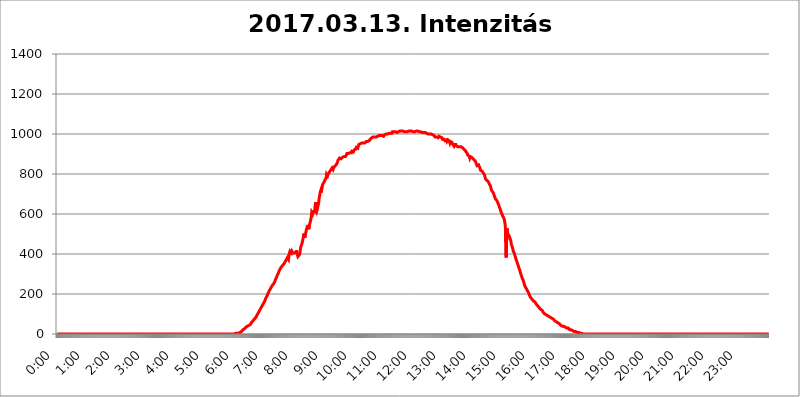
| Category | 2017.03.13. Intenzitás [W/m^2] |
|---|---|
| 0.0 | 0 |
| 0.0006944444444444445 | 0 |
| 0.001388888888888889 | 0 |
| 0.0020833333333333333 | 0 |
| 0.002777777777777778 | 0 |
| 0.003472222222222222 | 0 |
| 0.004166666666666667 | 0 |
| 0.004861111111111111 | 0 |
| 0.005555555555555556 | 0 |
| 0.0062499999999999995 | 0 |
| 0.006944444444444444 | 0 |
| 0.007638888888888889 | 0 |
| 0.008333333333333333 | 0 |
| 0.009027777777777779 | 0 |
| 0.009722222222222222 | 0 |
| 0.010416666666666666 | 0 |
| 0.011111111111111112 | 0 |
| 0.011805555555555555 | 0 |
| 0.012499999999999999 | 0 |
| 0.013194444444444444 | 0 |
| 0.013888888888888888 | 0 |
| 0.014583333333333332 | 0 |
| 0.015277777777777777 | 0 |
| 0.015972222222222224 | 0 |
| 0.016666666666666666 | 0 |
| 0.017361111111111112 | 0 |
| 0.018055555555555557 | 0 |
| 0.01875 | 0 |
| 0.019444444444444445 | 0 |
| 0.02013888888888889 | 0 |
| 0.020833333333333332 | 0 |
| 0.02152777777777778 | 0 |
| 0.022222222222222223 | 0 |
| 0.02291666666666667 | 0 |
| 0.02361111111111111 | 0 |
| 0.024305555555555556 | 0 |
| 0.024999999999999998 | 0 |
| 0.025694444444444447 | 0 |
| 0.02638888888888889 | 0 |
| 0.027083333333333334 | 0 |
| 0.027777777777777776 | 0 |
| 0.02847222222222222 | 0 |
| 0.029166666666666664 | 0 |
| 0.029861111111111113 | 0 |
| 0.030555555555555555 | 0 |
| 0.03125 | 0 |
| 0.03194444444444445 | 0 |
| 0.03263888888888889 | 0 |
| 0.03333333333333333 | 0 |
| 0.034027777777777775 | 0 |
| 0.034722222222222224 | 0 |
| 0.035416666666666666 | 0 |
| 0.036111111111111115 | 0 |
| 0.03680555555555556 | 0 |
| 0.0375 | 0 |
| 0.03819444444444444 | 0 |
| 0.03888888888888889 | 0 |
| 0.03958333333333333 | 0 |
| 0.04027777777777778 | 0 |
| 0.04097222222222222 | 0 |
| 0.041666666666666664 | 0 |
| 0.042361111111111106 | 0 |
| 0.04305555555555556 | 0 |
| 0.043750000000000004 | 0 |
| 0.044444444444444446 | 0 |
| 0.04513888888888889 | 0 |
| 0.04583333333333334 | 0 |
| 0.04652777777777778 | 0 |
| 0.04722222222222222 | 0 |
| 0.04791666666666666 | 0 |
| 0.04861111111111111 | 0 |
| 0.049305555555555554 | 0 |
| 0.049999999999999996 | 0 |
| 0.05069444444444445 | 0 |
| 0.051388888888888894 | 0 |
| 0.052083333333333336 | 0 |
| 0.05277777777777778 | 0 |
| 0.05347222222222222 | 0 |
| 0.05416666666666667 | 0 |
| 0.05486111111111111 | 0 |
| 0.05555555555555555 | 0 |
| 0.05625 | 0 |
| 0.05694444444444444 | 0 |
| 0.057638888888888885 | 0 |
| 0.05833333333333333 | 0 |
| 0.05902777777777778 | 0 |
| 0.059722222222222225 | 0 |
| 0.06041666666666667 | 0 |
| 0.061111111111111116 | 0 |
| 0.06180555555555556 | 0 |
| 0.0625 | 0 |
| 0.06319444444444444 | 0 |
| 0.06388888888888888 | 0 |
| 0.06458333333333334 | 0 |
| 0.06527777777777778 | 0 |
| 0.06597222222222222 | 0 |
| 0.06666666666666667 | 0 |
| 0.06736111111111111 | 0 |
| 0.06805555555555555 | 0 |
| 0.06874999999999999 | 0 |
| 0.06944444444444443 | 0 |
| 0.07013888888888889 | 0 |
| 0.07083333333333333 | 0 |
| 0.07152777777777779 | 0 |
| 0.07222222222222223 | 0 |
| 0.07291666666666667 | 0 |
| 0.07361111111111111 | 0 |
| 0.07430555555555556 | 0 |
| 0.075 | 0 |
| 0.07569444444444444 | 0 |
| 0.0763888888888889 | 0 |
| 0.07708333333333334 | 0 |
| 0.07777777777777778 | 0 |
| 0.07847222222222222 | 0 |
| 0.07916666666666666 | 0 |
| 0.0798611111111111 | 0 |
| 0.08055555555555556 | 0 |
| 0.08125 | 0 |
| 0.08194444444444444 | 0 |
| 0.08263888888888889 | 0 |
| 0.08333333333333333 | 0 |
| 0.08402777777777777 | 0 |
| 0.08472222222222221 | 0 |
| 0.08541666666666665 | 0 |
| 0.08611111111111112 | 0 |
| 0.08680555555555557 | 0 |
| 0.08750000000000001 | 0 |
| 0.08819444444444445 | 0 |
| 0.08888888888888889 | 0 |
| 0.08958333333333333 | 0 |
| 0.09027777777777778 | 0 |
| 0.09097222222222222 | 0 |
| 0.09166666666666667 | 0 |
| 0.09236111111111112 | 0 |
| 0.09305555555555556 | 0 |
| 0.09375 | 0 |
| 0.09444444444444444 | 0 |
| 0.09513888888888888 | 0 |
| 0.09583333333333333 | 0 |
| 0.09652777777777777 | 0 |
| 0.09722222222222222 | 0 |
| 0.09791666666666667 | 0 |
| 0.09861111111111111 | 0 |
| 0.09930555555555555 | 0 |
| 0.09999999999999999 | 0 |
| 0.10069444444444443 | 0 |
| 0.1013888888888889 | 0 |
| 0.10208333333333335 | 0 |
| 0.10277777777777779 | 0 |
| 0.10347222222222223 | 0 |
| 0.10416666666666667 | 0 |
| 0.10486111111111111 | 0 |
| 0.10555555555555556 | 0 |
| 0.10625 | 0 |
| 0.10694444444444444 | 0 |
| 0.1076388888888889 | 0 |
| 0.10833333333333334 | 0 |
| 0.10902777777777778 | 0 |
| 0.10972222222222222 | 0 |
| 0.1111111111111111 | 0 |
| 0.11180555555555556 | 0 |
| 0.11180555555555556 | 0 |
| 0.1125 | 0 |
| 0.11319444444444444 | 0 |
| 0.11388888888888889 | 0 |
| 0.11458333333333333 | 0 |
| 0.11527777777777777 | 0 |
| 0.11597222222222221 | 0 |
| 0.11666666666666665 | 0 |
| 0.1173611111111111 | 0 |
| 0.11805555555555557 | 0 |
| 0.11944444444444445 | 0 |
| 0.12013888888888889 | 0 |
| 0.12083333333333333 | 0 |
| 0.12152777777777778 | 0 |
| 0.12222222222222223 | 0 |
| 0.12291666666666667 | 0 |
| 0.12291666666666667 | 0 |
| 0.12361111111111112 | 0 |
| 0.12430555555555556 | 0 |
| 0.125 | 0 |
| 0.12569444444444444 | 0 |
| 0.12638888888888888 | 0 |
| 0.12708333333333333 | 0 |
| 0.16875 | 0 |
| 0.12847222222222224 | 0 |
| 0.12916666666666668 | 0 |
| 0.12986111111111112 | 0 |
| 0.13055555555555556 | 0 |
| 0.13125 | 0 |
| 0.13194444444444445 | 0 |
| 0.1326388888888889 | 0 |
| 0.13333333333333333 | 0 |
| 0.13402777777777777 | 0 |
| 0.13402777777777777 | 0 |
| 0.13472222222222222 | 0 |
| 0.13541666666666666 | 0 |
| 0.1361111111111111 | 0 |
| 0.13749999999999998 | 0 |
| 0.13819444444444443 | 0 |
| 0.1388888888888889 | 0 |
| 0.13958333333333334 | 0 |
| 0.14027777777777778 | 0 |
| 0.14097222222222222 | 0 |
| 0.14166666666666666 | 0 |
| 0.1423611111111111 | 0 |
| 0.14305555555555557 | 0 |
| 0.14375000000000002 | 0 |
| 0.14444444444444446 | 0 |
| 0.1451388888888889 | 0 |
| 0.1451388888888889 | 0 |
| 0.14652777777777778 | 0 |
| 0.14722222222222223 | 0 |
| 0.14791666666666667 | 0 |
| 0.1486111111111111 | 0 |
| 0.14930555555555555 | 0 |
| 0.15 | 0 |
| 0.15069444444444444 | 0 |
| 0.15138888888888888 | 0 |
| 0.15208333333333332 | 0 |
| 0.15277777777777776 | 0 |
| 0.15347222222222223 | 0 |
| 0.15416666666666667 | 0 |
| 0.15486111111111112 | 0 |
| 0.15555555555555556 | 0 |
| 0.15625 | 0 |
| 0.15694444444444444 | 0 |
| 0.15763888888888888 | 0 |
| 0.15833333333333333 | 0 |
| 0.15902777777777777 | 0 |
| 0.15972222222222224 | 0 |
| 0.16041666666666668 | 0 |
| 0.16111111111111112 | 0 |
| 0.16180555555555556 | 0 |
| 0.1625 | 0 |
| 0.16319444444444445 | 0 |
| 0.1638888888888889 | 0 |
| 0.16458333333333333 | 0 |
| 0.16527777777777777 | 0 |
| 0.16597222222222222 | 0 |
| 0.16666666666666666 | 0 |
| 0.1673611111111111 | 0 |
| 0.16805555555555554 | 0 |
| 0.16874999999999998 | 0 |
| 0.16944444444444443 | 0 |
| 0.17013888888888887 | 0 |
| 0.1708333333333333 | 0 |
| 0.17152777777777775 | 0 |
| 0.17222222222222225 | 0 |
| 0.1729166666666667 | 0 |
| 0.17361111111111113 | 0 |
| 0.17430555555555557 | 0 |
| 0.17500000000000002 | 0 |
| 0.17569444444444446 | 0 |
| 0.1763888888888889 | 0 |
| 0.17708333333333334 | 0 |
| 0.17777777777777778 | 0 |
| 0.17847222222222223 | 0 |
| 0.17916666666666667 | 0 |
| 0.1798611111111111 | 0 |
| 0.18055555555555555 | 0 |
| 0.18125 | 0 |
| 0.18194444444444444 | 0 |
| 0.1826388888888889 | 0 |
| 0.18333333333333335 | 0 |
| 0.1840277777777778 | 0 |
| 0.18472222222222223 | 0 |
| 0.18541666666666667 | 0 |
| 0.18611111111111112 | 0 |
| 0.18680555555555556 | 0 |
| 0.1875 | 0 |
| 0.18819444444444444 | 0 |
| 0.18888888888888888 | 0 |
| 0.18958333333333333 | 0 |
| 0.19027777777777777 | 0 |
| 0.1909722222222222 | 0 |
| 0.19166666666666665 | 0 |
| 0.19236111111111112 | 0 |
| 0.19305555555555554 | 0 |
| 0.19375 | 0 |
| 0.19444444444444445 | 0 |
| 0.1951388888888889 | 0 |
| 0.19583333333333333 | 0 |
| 0.19652777777777777 | 0 |
| 0.19722222222222222 | 0 |
| 0.19791666666666666 | 0 |
| 0.1986111111111111 | 0 |
| 0.19930555555555554 | 0 |
| 0.19999999999999998 | 0 |
| 0.20069444444444443 | 0 |
| 0.20138888888888887 | 0 |
| 0.2020833333333333 | 0 |
| 0.2027777777777778 | 0 |
| 0.2034722222222222 | 0 |
| 0.2041666666666667 | 0 |
| 0.20486111111111113 | 0 |
| 0.20555555555555557 | 0 |
| 0.20625000000000002 | 0 |
| 0.20694444444444446 | 0 |
| 0.2076388888888889 | 0 |
| 0.20833333333333334 | 0 |
| 0.20902777777777778 | 0 |
| 0.20972222222222223 | 0 |
| 0.21041666666666667 | 0 |
| 0.2111111111111111 | 0 |
| 0.21180555555555555 | 0 |
| 0.2125 | 0 |
| 0.21319444444444444 | 0 |
| 0.2138888888888889 | 0 |
| 0.21458333333333335 | 0 |
| 0.2152777777777778 | 0 |
| 0.21597222222222223 | 0 |
| 0.21666666666666667 | 0 |
| 0.21736111111111112 | 0 |
| 0.21805555555555556 | 0 |
| 0.21875 | 0 |
| 0.21944444444444444 | 0 |
| 0.22013888888888888 | 0 |
| 0.22083333333333333 | 0 |
| 0.22152777777777777 | 0 |
| 0.2222222222222222 | 0 |
| 0.22291666666666665 | 0 |
| 0.2236111111111111 | 0 |
| 0.22430555555555556 | 0 |
| 0.225 | 0 |
| 0.22569444444444445 | 0 |
| 0.2263888888888889 | 0 |
| 0.22708333333333333 | 0 |
| 0.22777777777777777 | 0 |
| 0.22847222222222222 | 0 |
| 0.22916666666666666 | 0 |
| 0.2298611111111111 | 0 |
| 0.23055555555555554 | 0 |
| 0.23124999999999998 | 0 |
| 0.23194444444444443 | 0 |
| 0.23263888888888887 | 0 |
| 0.2333333333333333 | 0 |
| 0.2340277777777778 | 0 |
| 0.2347222222222222 | 0 |
| 0.2354166666666667 | 0 |
| 0.23611111111111113 | 0 |
| 0.23680555555555557 | 0 |
| 0.23750000000000002 | 0 |
| 0.23819444444444446 | 0 |
| 0.2388888888888889 | 0 |
| 0.23958333333333334 | 0 |
| 0.24027777777777778 | 0 |
| 0.24097222222222223 | 0 |
| 0.24166666666666667 | 0 |
| 0.2423611111111111 | 0 |
| 0.24305555555555555 | 0 |
| 0.24375 | 0 |
| 0.24444444444444446 | 0 |
| 0.24513888888888888 | 0 |
| 0.24583333333333335 | 0 |
| 0.2465277777777778 | 0 |
| 0.24722222222222223 | 0 |
| 0.24791666666666667 | 0 |
| 0.24861111111111112 | 0 |
| 0.24930555555555556 | 0 |
| 0.25 | 3.525 |
| 0.25069444444444444 | 3.525 |
| 0.2513888888888889 | 3.525 |
| 0.2520833333333333 | 3.525 |
| 0.25277777777777777 | 3.525 |
| 0.2534722222222222 | 3.525 |
| 0.25416666666666665 | 3.525 |
| 0.2548611111111111 | 3.525 |
| 0.2555555555555556 | 7.887 |
| 0.25625000000000003 | 7.887 |
| 0.2569444444444445 | 7.887 |
| 0.2576388888888889 | 12.257 |
| 0.25833333333333336 | 12.257 |
| 0.2590277777777778 | 12.257 |
| 0.25972222222222224 | 16.636 |
| 0.2604166666666667 | 21.024 |
| 0.2611111111111111 | 21.024 |
| 0.26180555555555557 | 25.419 |
| 0.2625 | 25.419 |
| 0.26319444444444445 | 29.823 |
| 0.2638888888888889 | 29.823 |
| 0.26458333333333334 | 34.234 |
| 0.2652777777777778 | 34.234 |
| 0.2659722222222222 | 38.653 |
| 0.26666666666666666 | 38.653 |
| 0.2673611111111111 | 38.653 |
| 0.26805555555555555 | 43.079 |
| 0.26875 | 43.079 |
| 0.26944444444444443 | 47.511 |
| 0.2701388888888889 | 47.511 |
| 0.2708333333333333 | 47.511 |
| 0.27152777777777776 | 51.951 |
| 0.2722222222222222 | 56.398 |
| 0.27291666666666664 | 56.398 |
| 0.2736111111111111 | 60.85 |
| 0.2743055555555555 | 65.31 |
| 0.27499999999999997 | 65.31 |
| 0.27569444444444446 | 69.775 |
| 0.27638888888888885 | 74.246 |
| 0.27708333333333335 | 78.722 |
| 0.2777777777777778 | 78.722 |
| 0.27847222222222223 | 83.205 |
| 0.2791666666666667 | 87.692 |
| 0.2798611111111111 | 92.184 |
| 0.28055555555555556 | 96.682 |
| 0.28125 | 101.184 |
| 0.28194444444444444 | 105.69 |
| 0.2826388888888889 | 110.201 |
| 0.2833333333333333 | 114.716 |
| 0.28402777777777777 | 119.235 |
| 0.2847222222222222 | 123.758 |
| 0.28541666666666665 | 128.284 |
| 0.28611111111111115 | 132.814 |
| 0.28680555555555554 | 137.347 |
| 0.28750000000000003 | 141.884 |
| 0.2881944444444445 | 146.423 |
| 0.2888888888888889 | 150.964 |
| 0.28958333333333336 | 155.509 |
| 0.2902777777777778 | 160.056 |
| 0.29097222222222224 | 164.605 |
| 0.2916666666666667 | 169.156 |
| 0.2923611111111111 | 178.264 |
| 0.29305555555555557 | 182.82 |
| 0.29375 | 187.378 |
| 0.29444444444444445 | 191.937 |
| 0.2951388888888889 | 196.497 |
| 0.29583333333333334 | 205.62 |
| 0.2965277777777778 | 210.182 |
| 0.2972222222222222 | 214.746 |
| 0.29791666666666666 | 219.309 |
| 0.2986111111111111 | 223.873 |
| 0.29930555555555555 | 228.436 |
| 0.3 | 233 |
| 0.30069444444444443 | 237.564 |
| 0.3013888888888889 | 242.127 |
| 0.3020833333333333 | 246.689 |
| 0.30277777777777776 | 246.689 |
| 0.3034722222222222 | 251.251 |
| 0.30416666666666664 | 255.813 |
| 0.3048611111111111 | 260.373 |
| 0.3055555555555555 | 264.932 |
| 0.30624999999999997 | 274.047 |
| 0.3069444444444444 | 278.603 |
| 0.3076388888888889 | 283.156 |
| 0.30833333333333335 | 292.259 |
| 0.3090277777777778 | 296.808 |
| 0.30972222222222223 | 301.354 |
| 0.3104166666666667 | 305.898 |
| 0.3111111111111111 | 314.98 |
| 0.31180555555555556 | 319.517 |
| 0.3125 | 324.052 |
| 0.31319444444444444 | 328.584 |
| 0.3138888888888889 | 333.113 |
| 0.3145833333333333 | 333.113 |
| 0.31527777777777777 | 337.639 |
| 0.3159722222222222 | 342.162 |
| 0.31666666666666665 | 342.162 |
| 0.31736111111111115 | 346.682 |
| 0.31805555555555554 | 351.198 |
| 0.31875000000000003 | 355.712 |
| 0.3194444444444445 | 360.221 |
| 0.3201388888888889 | 364.728 |
| 0.32083333333333336 | 369.23 |
| 0.3215277777777778 | 373.729 |
| 0.32222222222222224 | 373.729 |
| 0.3229166666666667 | 382.715 |
| 0.3236111111111111 | 378.224 |
| 0.32430555555555557 | 373.729 |
| 0.325 | 391.685 |
| 0.32569444444444445 | 405.108 |
| 0.3263888888888889 | 414.035 |
| 0.32708333333333334 | 414.035 |
| 0.3277777777777778 | 409.574 |
| 0.3284722222222222 | 405.108 |
| 0.32916666666666666 | 414.035 |
| 0.3298611111111111 | 409.574 |
| 0.33055555555555555 | 405.108 |
| 0.33125 | 405.108 |
| 0.33194444444444443 | 405.108 |
| 0.3326388888888889 | 405.108 |
| 0.3333333333333333 | 409.574 |
| 0.3340277777777778 | 405.108 |
| 0.3347222222222222 | 409.574 |
| 0.3354166666666667 | 418.492 |
| 0.3361111111111111 | 405.108 |
| 0.3368055555555556 | 396.164 |
| 0.33749999999999997 | 387.202 |
| 0.33819444444444446 | 382.715 |
| 0.33888888888888885 | 391.685 |
| 0.33958333333333335 | 396.164 |
| 0.34027777777777773 | 405.108 |
| 0.34097222222222223 | 422.943 |
| 0.3416666666666666 | 436.27 |
| 0.3423611111111111 | 440.702 |
| 0.3430555555555555 | 449.551 |
| 0.34375 | 453.968 |
| 0.3444444444444445 | 471.582 |
| 0.3451388888888889 | 484.735 |
| 0.3458333333333334 | 502.192 |
| 0.34652777777777777 | 493.475 |
| 0.34722222222222227 | 480.356 |
| 0.34791666666666665 | 497.836 |
| 0.34861111111111115 | 506.542 |
| 0.34930555555555554 | 519.555 |
| 0.35000000000000003 | 528.2 |
| 0.3506944444444444 | 532.513 |
| 0.3513888888888889 | 545.416 |
| 0.3520833333333333 | 545.416 |
| 0.3527777777777778 | 523.88 |
| 0.3534722222222222 | 541.121 |
| 0.3541666666666667 | 545.416 |
| 0.3548611111111111 | 545.416 |
| 0.35555555555555557 | 571.049 |
| 0.35625 | 583.779 |
| 0.35694444444444445 | 609.062 |
| 0.3576388888888889 | 609.062 |
| 0.35833333333333334 | 600.661 |
| 0.3590277777777778 | 609.062 |
| 0.3597222222222222 | 617.436 |
| 0.36041666666666666 | 604.864 |
| 0.3611111111111111 | 613.252 |
| 0.36180555555555555 | 646.537 |
| 0.3625 | 658.909 |
| 0.36319444444444443 | 621.613 |
| 0.3638888888888889 | 613.252 |
| 0.3645833333333333 | 621.613 |
| 0.3652777777777778 | 634.105 |
| 0.3659722222222222 | 629.948 |
| 0.3666666666666667 | 654.791 |
| 0.3673611111111111 | 679.395 |
| 0.3680555555555556 | 691.608 |
| 0.36874999999999997 | 707.8 |
| 0.36944444444444446 | 715.858 |
| 0.37013888888888885 | 707.8 |
| 0.37083333333333335 | 719.877 |
| 0.37152777777777773 | 731.896 |
| 0.37222222222222223 | 747.834 |
| 0.3729166666666666 | 747.834 |
| 0.3736111111111111 | 751.803 |
| 0.3743055555555555 | 759.723 |
| 0.375 | 763.674 |
| 0.3756944444444445 | 771.559 |
| 0.3763888888888889 | 775.492 |
| 0.3770833333333334 | 779.42 |
| 0.37777777777777777 | 798.974 |
| 0.37847222222222227 | 798.974 |
| 0.37916666666666665 | 791.169 |
| 0.37986111111111115 | 798.974 |
| 0.38055555555555554 | 798.974 |
| 0.38125000000000003 | 806.757 |
| 0.3819444444444444 | 806.757 |
| 0.3826388888888889 | 814.519 |
| 0.3833333333333333 | 818.392 |
| 0.3840277777777778 | 822.26 |
| 0.3847222222222222 | 826.123 |
| 0.3854166666666667 | 829.981 |
| 0.3861111111111111 | 826.123 |
| 0.38680555555555557 | 822.26 |
| 0.3875 | 829.981 |
| 0.38819444444444445 | 829.981 |
| 0.3888888888888889 | 837.682 |
| 0.38958333333333334 | 841.526 |
| 0.3902777777777778 | 837.682 |
| 0.3909722222222222 | 845.365 |
| 0.39166666666666666 | 845.365 |
| 0.3923611111111111 | 853.029 |
| 0.39305555555555555 | 860.676 |
| 0.39375 | 868.305 |
| 0.39444444444444443 | 872.114 |
| 0.3951388888888889 | 868.305 |
| 0.3958333333333333 | 879.719 |
| 0.3965277777777778 | 879.719 |
| 0.3972222222222222 | 875.918 |
| 0.3979166666666667 | 875.918 |
| 0.3986111111111111 | 879.719 |
| 0.3993055555555556 | 879.719 |
| 0.39999999999999997 | 883.516 |
| 0.40069444444444446 | 887.309 |
| 0.40138888888888885 | 887.309 |
| 0.40208333333333335 | 887.309 |
| 0.40277777777777773 | 891.099 |
| 0.40347222222222223 | 887.309 |
| 0.4041666666666666 | 887.309 |
| 0.4048611111111111 | 891.099 |
| 0.4055555555555555 | 894.885 |
| 0.40625 | 902.447 |
| 0.4069444444444445 | 902.447 |
| 0.4076388888888889 | 902.447 |
| 0.4083333333333334 | 902.447 |
| 0.40902777777777777 | 898.668 |
| 0.40972222222222227 | 902.447 |
| 0.41041666666666665 | 906.223 |
| 0.41111111111111115 | 902.447 |
| 0.41180555555555554 | 902.447 |
| 0.41250000000000003 | 906.223 |
| 0.4131944444444444 | 913.766 |
| 0.4138888888888889 | 913.766 |
| 0.4145833333333333 | 913.766 |
| 0.4152777777777778 | 909.996 |
| 0.4159722222222222 | 906.223 |
| 0.4166666666666667 | 921.298 |
| 0.4173611111111111 | 925.06 |
| 0.41805555555555557 | 925.06 |
| 0.41875 | 925.06 |
| 0.41944444444444445 | 932.576 |
| 0.4201388888888889 | 932.576 |
| 0.42083333333333334 | 928.819 |
| 0.4215277777777778 | 928.819 |
| 0.4222222222222222 | 940.082 |
| 0.42291666666666666 | 947.58 |
| 0.4236111111111111 | 943.832 |
| 0.42430555555555555 | 947.58 |
| 0.425 | 951.327 |
| 0.42569444444444443 | 955.071 |
| 0.4263888888888889 | 951.327 |
| 0.4270833333333333 | 955.071 |
| 0.4277777777777778 | 955.071 |
| 0.4284722222222222 | 955.071 |
| 0.4291666666666667 | 955.071 |
| 0.4298611111111111 | 955.071 |
| 0.4305555555555556 | 955.071 |
| 0.43124999999999997 | 955.071 |
| 0.43194444444444446 | 958.814 |
| 0.43263888888888885 | 955.071 |
| 0.43333333333333335 | 962.555 |
| 0.43402777777777773 | 966.295 |
| 0.43472222222222223 | 962.555 |
| 0.4354166666666666 | 962.555 |
| 0.4361111111111111 | 966.295 |
| 0.4368055555555555 | 962.555 |
| 0.4375 | 966.295 |
| 0.4381944444444445 | 970.034 |
| 0.4388888888888889 | 973.772 |
| 0.4395833333333334 | 973.772 |
| 0.44027777777777777 | 970.034 |
| 0.44097222222222227 | 981.244 |
| 0.44166666666666665 | 981.244 |
| 0.44236111111111115 | 981.244 |
| 0.44305555555555554 | 984.98 |
| 0.44375000000000003 | 981.244 |
| 0.4444444444444444 | 984.98 |
| 0.4451388888888889 | 984.98 |
| 0.4458333333333333 | 988.714 |
| 0.4465277777777778 | 988.714 |
| 0.4472222222222222 | 984.98 |
| 0.4479166666666667 | 984.98 |
| 0.4486111111111111 | 984.98 |
| 0.44930555555555557 | 988.714 |
| 0.45 | 992.448 |
| 0.45069444444444445 | 992.448 |
| 0.4513888888888889 | 992.448 |
| 0.45208333333333334 | 988.714 |
| 0.4527777777777778 | 992.448 |
| 0.4534722222222222 | 992.448 |
| 0.45416666666666666 | 992.448 |
| 0.4548611111111111 | 992.448 |
| 0.45555555555555555 | 992.448 |
| 0.45625 | 992.448 |
| 0.45694444444444443 | 992.448 |
| 0.4576388888888889 | 988.714 |
| 0.4583333333333333 | 992.448 |
| 0.4590277777777778 | 996.182 |
| 0.4597222222222222 | 999.916 |
| 0.4604166666666667 | 999.916 |
| 0.4611111111111111 | 999.916 |
| 0.4618055555555556 | 999.916 |
| 0.46249999999999997 | 999.916 |
| 0.46319444444444446 | 999.916 |
| 0.46388888888888885 | 1003.65 |
| 0.46458333333333335 | 1003.65 |
| 0.46527777777777773 | 1003.65 |
| 0.46597222222222223 | 1003.65 |
| 0.4666666666666666 | 1003.65 |
| 0.4673611111111111 | 1003.65 |
| 0.4680555555555555 | 1003.65 |
| 0.46875 | 1003.65 |
| 0.4694444444444445 | 1003.65 |
| 0.4701388888888889 | 1011.118 |
| 0.4708333333333334 | 1011.118 |
| 0.47152777777777777 | 1011.118 |
| 0.47222222222222227 | 1011.118 |
| 0.47291666666666665 | 1007.383 |
| 0.47361111111111115 | 1011.118 |
| 0.47430555555555554 | 1011.118 |
| 0.47500000000000003 | 1011.118 |
| 0.4756944444444444 | 1007.383 |
| 0.4763888888888889 | 1007.383 |
| 0.4770833333333333 | 1011.118 |
| 0.4777777777777778 | 1007.383 |
| 0.4784722222222222 | 1011.118 |
| 0.4791666666666667 | 1011.118 |
| 0.4798611111111111 | 1007.383 |
| 0.48055555555555557 | 1014.852 |
| 0.48125 | 1018.587 |
| 0.48194444444444445 | 1014.852 |
| 0.4826388888888889 | 1014.852 |
| 0.48333333333333334 | 1011.118 |
| 0.4840277777777778 | 1014.852 |
| 0.4847222222222222 | 1014.852 |
| 0.48541666666666666 | 1011.118 |
| 0.4861111111111111 | 1014.852 |
| 0.48680555555555555 | 1011.118 |
| 0.4875 | 1014.852 |
| 0.48819444444444443 | 1014.852 |
| 0.4888888888888889 | 1011.118 |
| 0.4895833333333333 | 1011.118 |
| 0.4902777777777778 | 1011.118 |
| 0.4909722222222222 | 1011.118 |
| 0.4916666666666667 | 1014.852 |
| 0.4923611111111111 | 1014.852 |
| 0.4930555555555556 | 1014.852 |
| 0.49374999999999997 | 1014.852 |
| 0.49444444444444446 | 1014.852 |
| 0.49513888888888885 | 1014.852 |
| 0.49583333333333335 | 1011.118 |
| 0.49652777777777773 | 1014.852 |
| 0.49722222222222223 | 1014.852 |
| 0.4979166666666666 | 1014.852 |
| 0.4986111111111111 | 1014.852 |
| 0.4993055555555555 | 1011.118 |
| 0.5 | 1011.118 |
| 0.5006944444444444 | 1011.118 |
| 0.5013888888888889 | 1011.118 |
| 0.5020833333333333 | 1011.118 |
| 0.5027777777777778 | 1014.852 |
| 0.5034722222222222 | 1014.852 |
| 0.5041666666666667 | 1011.118 |
| 0.5048611111111111 | 1014.852 |
| 0.5055555555555555 | 1014.852 |
| 0.50625 | 1011.118 |
| 0.5069444444444444 | 1011.118 |
| 0.5076388888888889 | 1011.118 |
| 0.5083333333333333 | 1007.383 |
| 0.5090277777777777 | 1007.383 |
| 0.5097222222222222 | 1011.118 |
| 0.5104166666666666 | 1007.383 |
| 0.5111111111111112 | 1007.383 |
| 0.5118055555555555 | 1007.383 |
| 0.5125000000000001 | 1011.118 |
| 0.5131944444444444 | 1011.118 |
| 0.513888888888889 | 1007.383 |
| 0.5145833333333333 | 1011.118 |
| 0.5152777777777778 | 1007.383 |
| 0.5159722222222222 | 1007.383 |
| 0.5166666666666667 | 1007.383 |
| 0.517361111111111 | 1007.383 |
| 0.5180555555555556 | 1003.65 |
| 0.5187499999999999 | 999.916 |
| 0.5194444444444445 | 999.916 |
| 0.5201388888888888 | 999.916 |
| 0.5208333333333334 | 999.916 |
| 0.5215277777777778 | 999.916 |
| 0.5222222222222223 | 999.916 |
| 0.5229166666666667 | 999.916 |
| 0.5236111111111111 | 999.916 |
| 0.5243055555555556 | 999.916 |
| 0.525 | 999.916 |
| 0.5256944444444445 | 999.916 |
| 0.5263888888888889 | 996.182 |
| 0.5270833333333333 | 992.448 |
| 0.5277777777777778 | 992.448 |
| 0.5284722222222222 | 992.448 |
| 0.5291666666666667 | 988.714 |
| 0.5298611111111111 | 984.98 |
| 0.5305555555555556 | 984.98 |
| 0.53125 | 981.244 |
| 0.5319444444444444 | 984.98 |
| 0.5326388888888889 | 984.98 |
| 0.5333333333333333 | 981.244 |
| 0.5340277777777778 | 981.244 |
| 0.5347222222222222 | 981.244 |
| 0.5354166666666667 | 988.714 |
| 0.5361111111111111 | 988.714 |
| 0.5368055555555555 | 984.98 |
| 0.5375 | 984.98 |
| 0.5381944444444444 | 988.714 |
| 0.5388888888888889 | 981.244 |
| 0.5395833333333333 | 981.244 |
| 0.5402777777777777 | 973.772 |
| 0.5409722222222222 | 977.508 |
| 0.5416666666666666 | 977.508 |
| 0.5423611111111112 | 973.772 |
| 0.5430555555555555 | 970.034 |
| 0.5437500000000001 | 966.295 |
| 0.5444444444444444 | 962.555 |
| 0.545138888888889 | 970.034 |
| 0.5458333333333333 | 970.034 |
| 0.5465277777777778 | 962.555 |
| 0.5472222222222222 | 966.295 |
| 0.5479166666666667 | 970.034 |
| 0.548611111111111 | 970.034 |
| 0.5493055555555556 | 966.295 |
| 0.5499999999999999 | 962.555 |
| 0.5506944444444445 | 955.071 |
| 0.5513888888888888 | 962.555 |
| 0.5520833333333334 | 962.555 |
| 0.5527777777777778 | 958.814 |
| 0.5534722222222223 | 958.814 |
| 0.5541666666666667 | 951.327 |
| 0.5548611111111111 | 955.071 |
| 0.5555555555555556 | 951.327 |
| 0.55625 | 940.082 |
| 0.5569444444444445 | 947.58 |
| 0.5576388888888889 | 951.327 |
| 0.5583333333333333 | 947.58 |
| 0.5590277777777778 | 947.58 |
| 0.5597222222222222 | 940.082 |
| 0.5604166666666667 | 936.33 |
| 0.5611111111111111 | 936.33 |
| 0.5618055555555556 | 936.33 |
| 0.5625 | 936.33 |
| 0.5631944444444444 | 940.082 |
| 0.5638888888888889 | 936.33 |
| 0.5645833333333333 | 932.576 |
| 0.5652777777777778 | 936.33 |
| 0.5659722222222222 | 936.33 |
| 0.5666666666666667 | 940.082 |
| 0.5673611111111111 | 932.576 |
| 0.5680555555555555 | 932.576 |
| 0.56875 | 932.576 |
| 0.5694444444444444 | 928.819 |
| 0.5701388888888889 | 925.06 |
| 0.5708333333333333 | 928.819 |
| 0.5715277777777777 | 921.298 |
| 0.5722222222222222 | 917.534 |
| 0.5729166666666666 | 917.534 |
| 0.5736111111111112 | 909.996 |
| 0.5743055555555555 | 906.223 |
| 0.5750000000000001 | 902.447 |
| 0.5756944444444444 | 894.885 |
| 0.576388888888889 | 894.885 |
| 0.5770833333333333 | 898.668 |
| 0.5777777777777778 | 887.309 |
| 0.5784722222222222 | 879.719 |
| 0.5791666666666667 | 887.309 |
| 0.579861111111111 | 891.099 |
| 0.5805555555555556 | 887.309 |
| 0.5812499999999999 | 883.516 |
| 0.5819444444444445 | 879.719 |
| 0.5826388888888888 | 879.719 |
| 0.5833333333333334 | 875.918 |
| 0.5840277777777778 | 875.918 |
| 0.5847222222222223 | 875.918 |
| 0.5854166666666667 | 868.305 |
| 0.5861111111111111 | 864.493 |
| 0.5868055555555556 | 860.676 |
| 0.5875 | 853.029 |
| 0.5881944444444445 | 853.029 |
| 0.5888888888888889 | 841.526 |
| 0.5895833333333333 | 845.365 |
| 0.5902777777777778 | 845.365 |
| 0.5909722222222222 | 845.365 |
| 0.5916666666666667 | 841.526 |
| 0.5923611111111111 | 833.834 |
| 0.5930555555555556 | 826.123 |
| 0.59375 | 818.392 |
| 0.5944444444444444 | 818.392 |
| 0.5951388888888889 | 814.519 |
| 0.5958333333333333 | 814.519 |
| 0.5965277777777778 | 814.519 |
| 0.5972222222222222 | 810.641 |
| 0.5979166666666667 | 802.868 |
| 0.5986111111111111 | 798.974 |
| 0.5993055555555555 | 795.074 |
| 0.6 | 783.342 |
| 0.6006944444444444 | 775.492 |
| 0.6013888888888889 | 771.559 |
| 0.6020833333333333 | 771.559 |
| 0.6027777777777777 | 767.62 |
| 0.6034722222222222 | 767.62 |
| 0.6041666666666666 | 763.674 |
| 0.6048611111111112 | 759.723 |
| 0.6055555555555555 | 755.766 |
| 0.6062500000000001 | 747.834 |
| 0.6069444444444444 | 747.834 |
| 0.607638888888889 | 739.877 |
| 0.6083333333333333 | 727.896 |
| 0.6090277777777778 | 719.877 |
| 0.6097222222222222 | 719.877 |
| 0.6104166666666667 | 711.832 |
| 0.611111111111111 | 707.8 |
| 0.6118055555555556 | 703.762 |
| 0.6124999999999999 | 695.666 |
| 0.6131944444444445 | 695.666 |
| 0.6138888888888888 | 691.608 |
| 0.6145833333333334 | 675.311 |
| 0.6152777777777778 | 675.311 |
| 0.6159722222222223 | 671.22 |
| 0.6166666666666667 | 667.123 |
| 0.6173611111111111 | 663.019 |
| 0.6180555555555556 | 654.791 |
| 0.61875 | 654.791 |
| 0.6194444444444445 | 642.4 |
| 0.6201388888888889 | 634.105 |
| 0.6208333333333333 | 629.948 |
| 0.6215277777777778 | 621.613 |
| 0.6222222222222222 | 613.252 |
| 0.6229166666666667 | 609.062 |
| 0.6236111111111111 | 600.661 |
| 0.6243055555555556 | 600.661 |
| 0.625 | 588.009 |
| 0.6256944444444444 | 583.779 |
| 0.6263888888888889 | 579.542 |
| 0.6270833333333333 | 571.049 |
| 0.6277777777777778 | 566.793 |
| 0.6284722222222222 | 541.121 |
| 0.6291666666666667 | 396.164 |
| 0.6298611111111111 | 382.715 |
| 0.6305555555555555 | 528.2 |
| 0.63125 | 515.223 |
| 0.6319444444444444 | 502.192 |
| 0.6326388888888889 | 497.836 |
| 0.6333333333333333 | 497.836 |
| 0.6340277777777777 | 489.108 |
| 0.6347222222222222 | 480.356 |
| 0.6354166666666666 | 475.972 |
| 0.6361111111111112 | 467.187 |
| 0.6368055555555555 | 449.551 |
| 0.6375000000000001 | 440.702 |
| 0.6381944444444444 | 436.27 |
| 0.638888888888889 | 427.39 |
| 0.6395833333333333 | 414.035 |
| 0.6402777777777778 | 409.574 |
| 0.6409722222222222 | 405.108 |
| 0.6416666666666667 | 396.164 |
| 0.642361111111111 | 387.202 |
| 0.6430555555555556 | 378.224 |
| 0.6437499999999999 | 378.224 |
| 0.6444444444444445 | 364.728 |
| 0.6451388888888888 | 355.712 |
| 0.6458333333333334 | 351.198 |
| 0.6465277777777778 | 342.162 |
| 0.6472222222222223 | 333.113 |
| 0.6479166666666667 | 328.584 |
| 0.6486111111111111 | 319.517 |
| 0.6493055555555556 | 310.44 |
| 0.65 | 301.354 |
| 0.6506944444444445 | 296.808 |
| 0.6513888888888889 | 287.709 |
| 0.6520833333333333 | 278.603 |
| 0.6527777777777778 | 274.047 |
| 0.6534722222222222 | 269.49 |
| 0.6541666666666667 | 260.373 |
| 0.6548611111111111 | 251.251 |
| 0.6555555555555556 | 242.127 |
| 0.65625 | 237.564 |
| 0.6569444444444444 | 233 |
| 0.6576388888888889 | 228.436 |
| 0.6583333333333333 | 223.873 |
| 0.6590277777777778 | 219.309 |
| 0.6597222222222222 | 214.746 |
| 0.6604166666666667 | 210.182 |
| 0.6611111111111111 | 205.62 |
| 0.6618055555555555 | 201.058 |
| 0.6625 | 191.937 |
| 0.6631944444444444 | 187.378 |
| 0.6638888888888889 | 182.82 |
| 0.6645833333333333 | 182.82 |
| 0.6652777777777777 | 178.264 |
| 0.6659722222222222 | 173.709 |
| 0.6666666666666666 | 173.709 |
| 0.6673611111111111 | 169.156 |
| 0.6680555555555556 | 164.605 |
| 0.6687500000000001 | 164.605 |
| 0.6694444444444444 | 160.056 |
| 0.6701388888888888 | 160.056 |
| 0.6708333333333334 | 155.509 |
| 0.6715277777777778 | 150.964 |
| 0.6722222222222222 | 150.964 |
| 0.6729166666666666 | 146.423 |
| 0.6736111111111112 | 141.884 |
| 0.6743055555555556 | 137.347 |
| 0.6749999999999999 | 137.347 |
| 0.6756944444444444 | 132.814 |
| 0.6763888888888889 | 132.814 |
| 0.6770833333333334 | 128.284 |
| 0.6777777777777777 | 123.758 |
| 0.6784722222222223 | 123.758 |
| 0.6791666666666667 | 119.235 |
| 0.6798611111111111 | 119.235 |
| 0.6805555555555555 | 114.716 |
| 0.68125 | 110.201 |
| 0.6819444444444445 | 110.201 |
| 0.6826388888888889 | 105.69 |
| 0.6833333333333332 | 101.184 |
| 0.6840277777777778 | 101.184 |
| 0.6847222222222222 | 96.682 |
| 0.6854166666666667 | 96.682 |
| 0.686111111111111 | 96.682 |
| 0.6868055555555556 | 92.184 |
| 0.6875 | 92.184 |
| 0.6881944444444444 | 92.184 |
| 0.688888888888889 | 87.692 |
| 0.6895833333333333 | 87.692 |
| 0.6902777777777778 | 83.205 |
| 0.6909722222222222 | 83.205 |
| 0.6916666666666668 | 83.205 |
| 0.6923611111111111 | 78.722 |
| 0.6930555555555555 | 78.722 |
| 0.69375 | 78.722 |
| 0.6944444444444445 | 74.246 |
| 0.6951388888888889 | 74.246 |
| 0.6958333333333333 | 74.246 |
| 0.6965277777777777 | 69.775 |
| 0.6972222222222223 | 69.775 |
| 0.6979166666666666 | 65.31 |
| 0.6986111111111111 | 65.31 |
| 0.6993055555555556 | 65.31 |
| 0.7000000000000001 | 60.85 |
| 0.7006944444444444 | 60.85 |
| 0.7013888888888888 | 56.398 |
| 0.7020833333333334 | 56.398 |
| 0.7027777777777778 | 56.398 |
| 0.7034722222222222 | 56.398 |
| 0.7041666666666666 | 51.951 |
| 0.7048611111111112 | 47.511 |
| 0.7055555555555556 | 47.511 |
| 0.7062499999999999 | 43.079 |
| 0.7069444444444444 | 43.079 |
| 0.7076388888888889 | 38.653 |
| 0.7083333333333334 | 38.653 |
| 0.7090277777777777 | 38.653 |
| 0.7097222222222223 | 38.653 |
| 0.7104166666666667 | 38.653 |
| 0.7111111111111111 | 34.234 |
| 0.7118055555555555 | 34.234 |
| 0.7125 | 34.234 |
| 0.7131944444444445 | 29.823 |
| 0.7138888888888889 | 29.823 |
| 0.7145833333333332 | 29.823 |
| 0.7152777777777778 | 29.823 |
| 0.7159722222222222 | 29.823 |
| 0.7166666666666667 | 29.823 |
| 0.717361111111111 | 25.419 |
| 0.7180555555555556 | 25.419 |
| 0.71875 | 21.024 |
| 0.7194444444444444 | 21.024 |
| 0.720138888888889 | 21.024 |
| 0.7208333333333333 | 21.024 |
| 0.7215277777777778 | 21.024 |
| 0.7222222222222222 | 16.636 |
| 0.7229166666666668 | 16.636 |
| 0.7236111111111111 | 16.636 |
| 0.7243055555555555 | 16.636 |
| 0.725 | 12.257 |
| 0.7256944444444445 | 12.257 |
| 0.7263888888888889 | 12.257 |
| 0.7270833333333333 | 12.257 |
| 0.7277777777777777 | 12.257 |
| 0.7284722222222223 | 7.887 |
| 0.7291666666666666 | 7.887 |
| 0.7298611111111111 | 7.887 |
| 0.7305555555555556 | 7.887 |
| 0.7312500000000001 | 7.887 |
| 0.7319444444444444 | 3.525 |
| 0.7326388888888888 | 3.525 |
| 0.7333333333333334 | 3.525 |
| 0.7340277777777778 | 3.525 |
| 0.7347222222222222 | 3.525 |
| 0.7354166666666666 | 3.525 |
| 0.7361111111111112 | 3.525 |
| 0.7368055555555556 | 3.525 |
| 0.7374999999999999 | 0 |
| 0.7381944444444444 | 0 |
| 0.7388888888888889 | 0 |
| 0.7395833333333334 | 0 |
| 0.7402777777777777 | 0 |
| 0.7409722222222223 | 0 |
| 0.7416666666666667 | 0 |
| 0.7423611111111111 | 0 |
| 0.7430555555555555 | 0 |
| 0.74375 | 0 |
| 0.7444444444444445 | 0 |
| 0.7451388888888889 | 0 |
| 0.7458333333333332 | 0 |
| 0.7465277777777778 | 0 |
| 0.7472222222222222 | 0 |
| 0.7479166666666667 | 0 |
| 0.748611111111111 | 0 |
| 0.7493055555555556 | 0 |
| 0.75 | 0 |
| 0.7506944444444444 | 0 |
| 0.751388888888889 | 0 |
| 0.7520833333333333 | 0 |
| 0.7527777777777778 | 0 |
| 0.7534722222222222 | 0 |
| 0.7541666666666668 | 0 |
| 0.7548611111111111 | 0 |
| 0.7555555555555555 | 0 |
| 0.75625 | 0 |
| 0.7569444444444445 | 0 |
| 0.7576388888888889 | 0 |
| 0.7583333333333333 | 0 |
| 0.7590277777777777 | 0 |
| 0.7597222222222223 | 0 |
| 0.7604166666666666 | 0 |
| 0.7611111111111111 | 0 |
| 0.7618055555555556 | 0 |
| 0.7625000000000001 | 0 |
| 0.7631944444444444 | 0 |
| 0.7638888888888888 | 0 |
| 0.7645833333333334 | 0 |
| 0.7652777777777778 | 0 |
| 0.7659722222222222 | 0 |
| 0.7666666666666666 | 0 |
| 0.7673611111111112 | 0 |
| 0.7680555555555556 | 0 |
| 0.7687499999999999 | 0 |
| 0.7694444444444444 | 0 |
| 0.7701388888888889 | 0 |
| 0.7708333333333334 | 0 |
| 0.7715277777777777 | 0 |
| 0.7722222222222223 | 0 |
| 0.7729166666666667 | 0 |
| 0.7736111111111111 | 0 |
| 0.7743055555555555 | 0 |
| 0.775 | 0 |
| 0.7756944444444445 | 0 |
| 0.7763888888888889 | 0 |
| 0.7770833333333332 | 0 |
| 0.7777777777777778 | 0 |
| 0.7784722222222222 | 0 |
| 0.7791666666666667 | 0 |
| 0.779861111111111 | 0 |
| 0.7805555555555556 | 0 |
| 0.78125 | 0 |
| 0.7819444444444444 | 0 |
| 0.782638888888889 | 0 |
| 0.7833333333333333 | 0 |
| 0.7840277777777778 | 0 |
| 0.7847222222222222 | 0 |
| 0.7854166666666668 | 0 |
| 0.7861111111111111 | 0 |
| 0.7868055555555555 | 0 |
| 0.7875 | 0 |
| 0.7881944444444445 | 0 |
| 0.7888888888888889 | 0 |
| 0.7895833333333333 | 0 |
| 0.7902777777777777 | 0 |
| 0.7909722222222223 | 0 |
| 0.7916666666666666 | 0 |
| 0.7923611111111111 | 0 |
| 0.7930555555555556 | 0 |
| 0.7937500000000001 | 0 |
| 0.7944444444444444 | 0 |
| 0.7951388888888888 | 0 |
| 0.7958333333333334 | 0 |
| 0.7965277777777778 | 0 |
| 0.7972222222222222 | 0 |
| 0.7979166666666666 | 0 |
| 0.7986111111111112 | 0 |
| 0.7993055555555556 | 0 |
| 0.7999999999999999 | 0 |
| 0.8006944444444444 | 0 |
| 0.8013888888888889 | 0 |
| 0.8020833333333334 | 0 |
| 0.8027777777777777 | 0 |
| 0.8034722222222223 | 0 |
| 0.8041666666666667 | 0 |
| 0.8048611111111111 | 0 |
| 0.8055555555555555 | 0 |
| 0.80625 | 0 |
| 0.8069444444444445 | 0 |
| 0.8076388888888889 | 0 |
| 0.8083333333333332 | 0 |
| 0.8090277777777778 | 0 |
| 0.8097222222222222 | 0 |
| 0.8104166666666667 | 0 |
| 0.811111111111111 | 0 |
| 0.8118055555555556 | 0 |
| 0.8125 | 0 |
| 0.8131944444444444 | 0 |
| 0.813888888888889 | 0 |
| 0.8145833333333333 | 0 |
| 0.8152777777777778 | 0 |
| 0.8159722222222222 | 0 |
| 0.8166666666666668 | 0 |
| 0.8173611111111111 | 0 |
| 0.8180555555555555 | 0 |
| 0.81875 | 0 |
| 0.8194444444444445 | 0 |
| 0.8201388888888889 | 0 |
| 0.8208333333333333 | 0 |
| 0.8215277777777777 | 0 |
| 0.8222222222222223 | 0 |
| 0.8229166666666666 | 0 |
| 0.8236111111111111 | 0 |
| 0.8243055555555556 | 0 |
| 0.8250000000000001 | 0 |
| 0.8256944444444444 | 0 |
| 0.8263888888888888 | 0 |
| 0.8270833333333334 | 0 |
| 0.8277777777777778 | 0 |
| 0.8284722222222222 | 0 |
| 0.8291666666666666 | 0 |
| 0.8298611111111112 | 0 |
| 0.8305555555555556 | 0 |
| 0.8312499999999999 | 0 |
| 0.8319444444444444 | 0 |
| 0.8326388888888889 | 0 |
| 0.8333333333333334 | 0 |
| 0.8340277777777777 | 0 |
| 0.8347222222222223 | 0 |
| 0.8354166666666667 | 0 |
| 0.8361111111111111 | 0 |
| 0.8368055555555555 | 0 |
| 0.8375 | 0 |
| 0.8381944444444445 | 0 |
| 0.8388888888888889 | 0 |
| 0.8395833333333332 | 0 |
| 0.8402777777777778 | 0 |
| 0.8409722222222222 | 0 |
| 0.8416666666666667 | 0 |
| 0.842361111111111 | 0 |
| 0.8430555555555556 | 0 |
| 0.84375 | 0 |
| 0.8444444444444444 | 0 |
| 0.845138888888889 | 0 |
| 0.8458333333333333 | 0 |
| 0.8465277777777778 | 0 |
| 0.8472222222222222 | 0 |
| 0.8479166666666668 | 0 |
| 0.8486111111111111 | 0 |
| 0.8493055555555555 | 0 |
| 0.85 | 0 |
| 0.8506944444444445 | 0 |
| 0.8513888888888889 | 0 |
| 0.8520833333333333 | 0 |
| 0.8527777777777777 | 0 |
| 0.8534722222222223 | 0 |
| 0.8541666666666666 | 0 |
| 0.8548611111111111 | 0 |
| 0.8555555555555556 | 0 |
| 0.8562500000000001 | 0 |
| 0.8569444444444444 | 0 |
| 0.8576388888888888 | 0 |
| 0.8583333333333334 | 0 |
| 0.8590277777777778 | 0 |
| 0.8597222222222222 | 0 |
| 0.8604166666666666 | 0 |
| 0.8611111111111112 | 0 |
| 0.8618055555555556 | 0 |
| 0.8624999999999999 | 0 |
| 0.8631944444444444 | 0 |
| 0.8638888888888889 | 0 |
| 0.8645833333333334 | 0 |
| 0.8652777777777777 | 0 |
| 0.8659722222222223 | 0 |
| 0.8666666666666667 | 0 |
| 0.8673611111111111 | 0 |
| 0.8680555555555555 | 0 |
| 0.86875 | 0 |
| 0.8694444444444445 | 0 |
| 0.8701388888888889 | 0 |
| 0.8708333333333332 | 0 |
| 0.8715277777777778 | 0 |
| 0.8722222222222222 | 0 |
| 0.8729166666666667 | 0 |
| 0.873611111111111 | 0 |
| 0.8743055555555556 | 0 |
| 0.875 | 0 |
| 0.8756944444444444 | 0 |
| 0.876388888888889 | 0 |
| 0.8770833333333333 | 0 |
| 0.8777777777777778 | 0 |
| 0.8784722222222222 | 0 |
| 0.8791666666666668 | 0 |
| 0.8798611111111111 | 0 |
| 0.8805555555555555 | 0 |
| 0.88125 | 0 |
| 0.8819444444444445 | 0 |
| 0.8826388888888889 | 0 |
| 0.8833333333333333 | 0 |
| 0.8840277777777777 | 0 |
| 0.8847222222222223 | 0 |
| 0.8854166666666666 | 0 |
| 0.8861111111111111 | 0 |
| 0.8868055555555556 | 0 |
| 0.8875000000000001 | 0 |
| 0.8881944444444444 | 0 |
| 0.8888888888888888 | 0 |
| 0.8895833333333334 | 0 |
| 0.8902777777777778 | 0 |
| 0.8909722222222222 | 0 |
| 0.8916666666666666 | 0 |
| 0.8923611111111112 | 0 |
| 0.8930555555555556 | 0 |
| 0.8937499999999999 | 0 |
| 0.8944444444444444 | 0 |
| 0.8951388888888889 | 0 |
| 0.8958333333333334 | 0 |
| 0.8965277777777777 | 0 |
| 0.8972222222222223 | 0 |
| 0.8979166666666667 | 0 |
| 0.8986111111111111 | 0 |
| 0.8993055555555555 | 0 |
| 0.9 | 0 |
| 0.9006944444444445 | 0 |
| 0.9013888888888889 | 0 |
| 0.9020833333333332 | 0 |
| 0.9027777777777778 | 0 |
| 0.9034722222222222 | 0 |
| 0.9041666666666667 | 0 |
| 0.904861111111111 | 0 |
| 0.9055555555555556 | 0 |
| 0.90625 | 0 |
| 0.9069444444444444 | 0 |
| 0.907638888888889 | 0 |
| 0.9083333333333333 | 0 |
| 0.9090277777777778 | 0 |
| 0.9097222222222222 | 0 |
| 0.9104166666666668 | 0 |
| 0.9111111111111111 | 0 |
| 0.9118055555555555 | 0 |
| 0.9125 | 0 |
| 0.9131944444444445 | 0 |
| 0.9138888888888889 | 0 |
| 0.9145833333333333 | 0 |
| 0.9152777777777777 | 0 |
| 0.9159722222222223 | 0 |
| 0.9166666666666666 | 0 |
| 0.9173611111111111 | 0 |
| 0.9180555555555556 | 0 |
| 0.9187500000000001 | 0 |
| 0.9194444444444444 | 0 |
| 0.9201388888888888 | 0 |
| 0.9208333333333334 | 0 |
| 0.9215277777777778 | 0 |
| 0.9222222222222222 | 0 |
| 0.9229166666666666 | 0 |
| 0.9236111111111112 | 0 |
| 0.9243055555555556 | 0 |
| 0.9249999999999999 | 0 |
| 0.9256944444444444 | 0 |
| 0.9263888888888889 | 0 |
| 0.9270833333333334 | 0 |
| 0.9277777777777777 | 0 |
| 0.9284722222222223 | 0 |
| 0.9291666666666667 | 0 |
| 0.9298611111111111 | 0 |
| 0.9305555555555555 | 0 |
| 0.93125 | 0 |
| 0.9319444444444445 | 0 |
| 0.9326388888888889 | 0 |
| 0.9333333333333332 | 0 |
| 0.9340277777777778 | 0 |
| 0.9347222222222222 | 0 |
| 0.9354166666666667 | 0 |
| 0.936111111111111 | 0 |
| 0.9368055555555556 | 0 |
| 0.9375 | 0 |
| 0.9381944444444444 | 0 |
| 0.938888888888889 | 0 |
| 0.9395833333333333 | 0 |
| 0.9402777777777778 | 0 |
| 0.9409722222222222 | 0 |
| 0.9416666666666668 | 0 |
| 0.9423611111111111 | 0 |
| 0.9430555555555555 | 0 |
| 0.94375 | 0 |
| 0.9444444444444445 | 0 |
| 0.9451388888888889 | 0 |
| 0.9458333333333333 | 0 |
| 0.9465277777777777 | 0 |
| 0.9472222222222223 | 0 |
| 0.9479166666666666 | 0 |
| 0.9486111111111111 | 0 |
| 0.9493055555555556 | 0 |
| 0.9500000000000001 | 0 |
| 0.9506944444444444 | 0 |
| 0.9513888888888888 | 0 |
| 0.9520833333333334 | 0 |
| 0.9527777777777778 | 0 |
| 0.9534722222222222 | 0 |
| 0.9541666666666666 | 0 |
| 0.9548611111111112 | 0 |
| 0.9555555555555556 | 0 |
| 0.9562499999999999 | 0 |
| 0.9569444444444444 | 0 |
| 0.9576388888888889 | 0 |
| 0.9583333333333334 | 0 |
| 0.9590277777777777 | 0 |
| 0.9597222222222223 | 0 |
| 0.9604166666666667 | 0 |
| 0.9611111111111111 | 0 |
| 0.9618055555555555 | 0 |
| 0.9625 | 0 |
| 0.9631944444444445 | 0 |
| 0.9638888888888889 | 0 |
| 0.9645833333333332 | 0 |
| 0.9652777777777778 | 0 |
| 0.9659722222222222 | 0 |
| 0.9666666666666667 | 0 |
| 0.967361111111111 | 0 |
| 0.9680555555555556 | 0 |
| 0.96875 | 0 |
| 0.9694444444444444 | 0 |
| 0.970138888888889 | 0 |
| 0.9708333333333333 | 0 |
| 0.9715277777777778 | 0 |
| 0.9722222222222222 | 0 |
| 0.9729166666666668 | 0 |
| 0.9736111111111111 | 0 |
| 0.9743055555555555 | 0 |
| 0.975 | 0 |
| 0.9756944444444445 | 0 |
| 0.9763888888888889 | 0 |
| 0.9770833333333333 | 0 |
| 0.9777777777777777 | 0 |
| 0.9784722222222223 | 0 |
| 0.9791666666666666 | 0 |
| 0.9798611111111111 | 0 |
| 0.9805555555555556 | 0 |
| 0.9812500000000001 | 0 |
| 0.9819444444444444 | 0 |
| 0.9826388888888888 | 0 |
| 0.9833333333333334 | 0 |
| 0.9840277777777778 | 0 |
| 0.9847222222222222 | 0 |
| 0.9854166666666666 | 0 |
| 0.9861111111111112 | 0 |
| 0.9868055555555556 | 0 |
| 0.9874999999999999 | 0 |
| 0.9881944444444444 | 0 |
| 0.9888888888888889 | 0 |
| 0.9895833333333334 | 0 |
| 0.9902777777777777 | 0 |
| 0.9909722222222223 | 0 |
| 0.9916666666666667 | 0 |
| 0.9923611111111111 | 0 |
| 0.9930555555555555 | 0 |
| 0.99375 | 0 |
| 0.9944444444444445 | 0 |
| 0.9951388888888889 | 0 |
| 0.9958333333333332 | 0 |
| 0.9965277777777778 | 0 |
| 0.9972222222222222 | 0 |
| 0.9979166666666667 | 0 |
| 0.998611111111111 | 0 |
| 0.9993055555555556 | 0 |